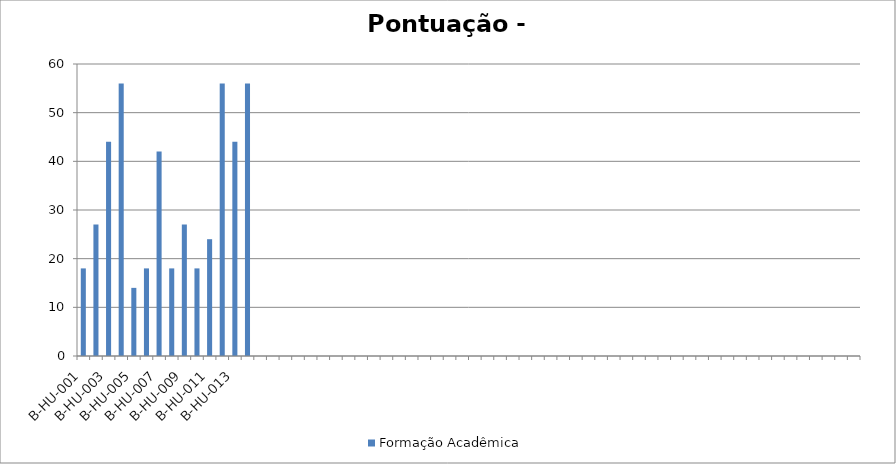
| Category | Formação Acadêmica |
|---|---|
| B-HU-001 | 18 |
| B-HU-002 | 27 |
| B-HU-003 | 44 |
| B-HU-004 | 56 |
| B-HU-005 | 14 |
| B-HU-006 | 18 |
| B-HU-007 | 42 |
| B-HU-008 | 18 |
| B-HU-009 | 27 |
| B-HU-010 | 18 |
| B-HU-011 | 24 |
| B-HU-012 | 56 |
| B-HU-013 | 44 |
| B-HU-014 | 56 |